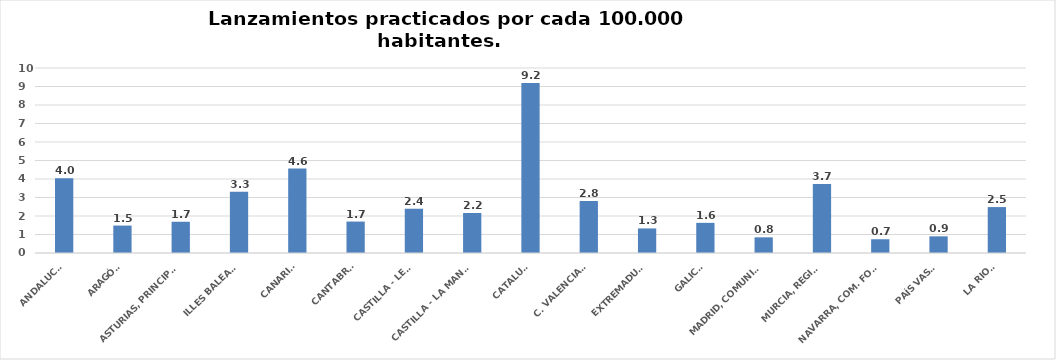
| Category | Series 0 |
|---|---|
| ANDALUCÍA | 4.037 |
| ARAGÓN | 1.482 |
| ASTURIAS, PRINCIPADO | 1.689 |
| ILLES BALEARS | 3.315 |
| CANARIAS | 4.564 |
| CANTABRIA | 1.699 |
| CASTILLA - LEÓN | 2.392 |
| CASTILLA - LA MANCHA | 2.163 |
| CATALUÑA | 9.191 |
| C. VALENCIANA | 2.817 |
| EXTREMADURA | 1.328 |
| GALICIA | 1.63 |
| MADRID, COMUNIDAD | 0.847 |
| MURCIA, REGIÓN | 3.735 |
| NAVARRA, COM. FORAL | 0.744 |
| PAÍS VASCO | 0.901 |
| LA RIOJA | 2.482 |